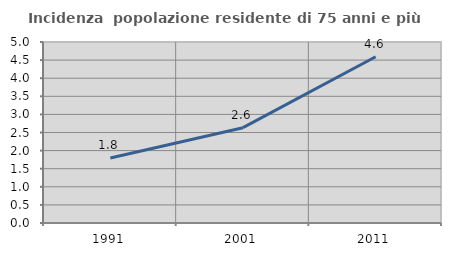
| Category | Incidenza  popolazione residente di 75 anni e più |
|---|---|
| 1991.0 | 1.797 |
| 2001.0 | 2.634 |
| 2011.0 | 4.592 |